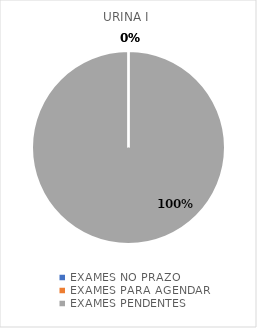
| Category | URINA I |
|---|---|
| EXAMES NO PRAZO | 0 |
| EXAMES PARA AGENDAR | 0 |
| EXAMES PENDENTES | 6 |